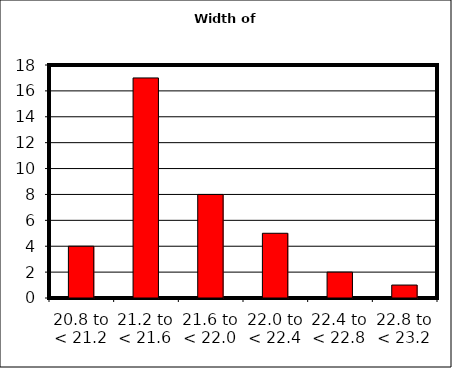
| Category | Series 0 |
|---|---|
| 20.8 to < 21.2 | 4 |
| 21.2 to < 21.6 | 17 |
| 21.6 to < 22.0 | 8 |
| 22.0 to < 22.4 | 5 |
| 22.4 to < 22.8 | 2 |
| 22.8 to < 23.2 | 1 |